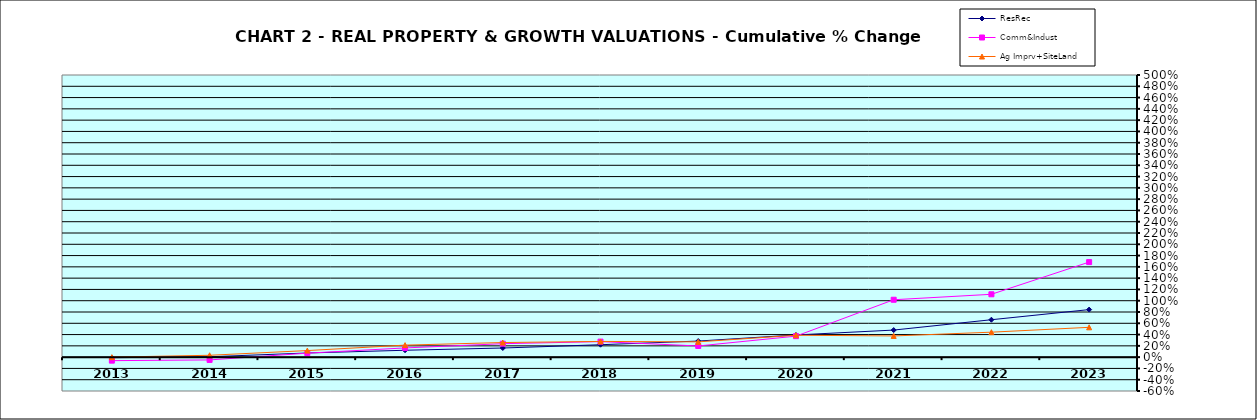
| Category | ResRec | Comm&Indust | Ag Imprv+SiteLand |
|---|---|---|---|
| 2013.0 | -0.01 | -0.062 | 0 |
| 2014.0 | 0.007 | -0.049 | 0.033 |
| 2015.0 | 0.074 | 0.07 | 0.117 |
| 2016.0 | 0.122 | 0.163 | 0.213 |
| 2017.0 | 0.162 | 0.238 | 0.259 |
| 2018.0 | 0.22 | 0.275 | 0.278 |
| 2019.0 | 0.285 | 0.198 | 0.271 |
| 2020.0 | 0.393 | 0.372 | 0.388 |
| 2021.0 | 0.48 | 1.017 | 0.376 |
| 2022.0 | 0.663 | 1.114 | 0.442 |
| 2023.0 | 0.842 | 1.684 | 0.529 |